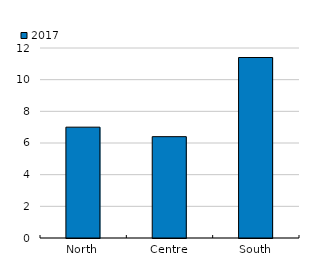
| Category | 2017 |
|---|---|
| North | 7 |
| Centre | 6.4 |
| South | 11.4 |